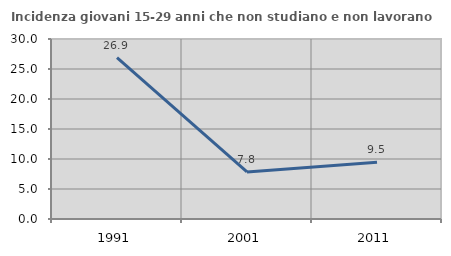
| Category | Incidenza giovani 15-29 anni che non studiano e non lavorano  |
|---|---|
| 1991.0 | 26.878 |
| 2001.0 | 7.843 |
| 2011.0 | 9.459 |